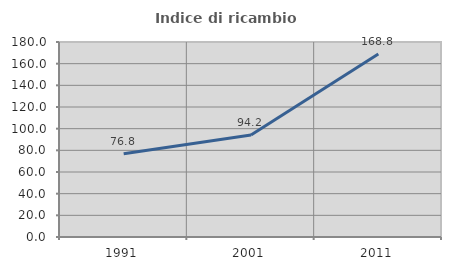
| Category | Indice di ricambio occupazionale  |
|---|---|
| 1991.0 | 76.768 |
| 2001.0 | 94.186 |
| 2011.0 | 168.831 |